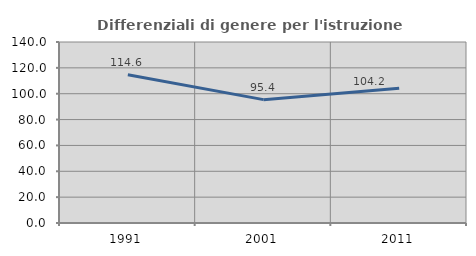
| Category | Differenziali di genere per l'istruzione superiore |
|---|---|
| 1991.0 | 114.607 |
| 2001.0 | 95.41 |
| 2011.0 | 104.161 |